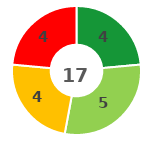
| Category | Series 0 |
|---|---|
| 0 | 4 |
| 1 | 5 |
| 2 | 4 |
| 3 | 4 |
| 4 | 0 |